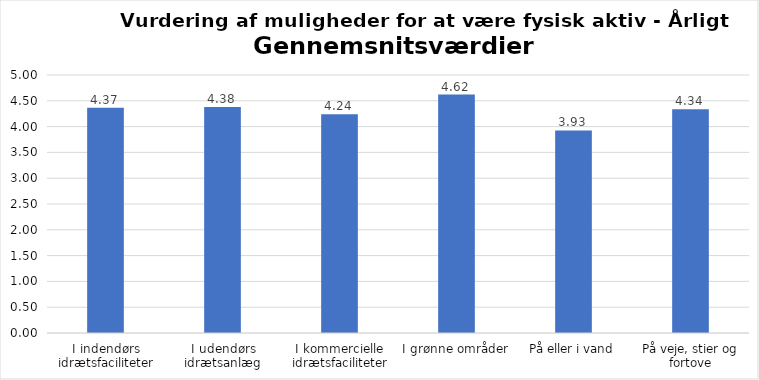
| Category | Gennemsnit |
|---|---|
| I indendørs idrætsfaciliteter | 4.366 |
| I udendørs idrætsanlæg | 4.378 |
| I kommercielle idrætsfaciliteter | 4.241 |
| I grønne områder | 4.622 |
| På eller i vand | 3.926 |
| På veje, stier og fortove | 4.338 |